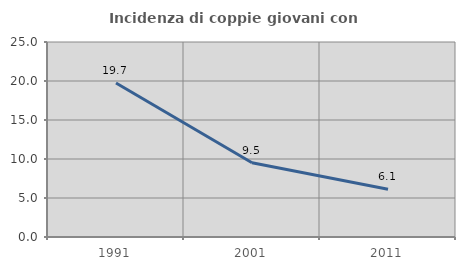
| Category | Incidenza di coppie giovani con figli |
|---|---|
| 1991.0 | 19.737 |
| 2001.0 | 9.524 |
| 2011.0 | 6.122 |